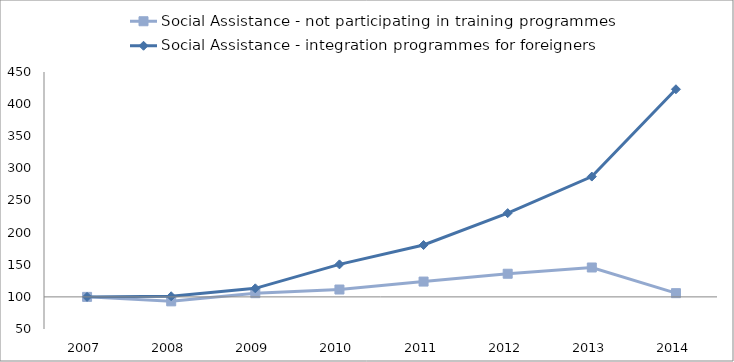
| Category | Social Assistance - not participating in training programmes | Social Assistance - integration programmes for foreigners | 0 |
|---|---|---|---|
| 2007.0 | 100 | 100 |  |
| 2008.0 | 93.029 | 100.925 |  |
| 2009.0 | 105.744 | 113.309 |  |
| 2010.0 | 111.447 | 150.583 |  |
| 2011.0 | 123.821 | 180.704 |  |
| 2012.0 | 136.005 | 230.367 |  |
| 2013.0 | 145.724 | 287.238 |  |
| 2014.0 | 105.783 | 423.146 |  |